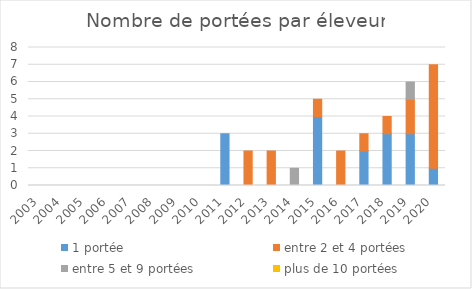
| Category | 1 portée | entre 2 et 4 portées | entre 5 et 9 portées | plus de 10 portées |
|---|---|---|---|---|
| 2003.0 | 0 | 0 | 0 | 0 |
| 2004.0 | 0 | 0 | 0 | 0 |
| 2005.0 | 0 | 0 | 0 | 0 |
| 2006.0 | 0 | 0 | 0 | 0 |
| 2007.0 | 0 | 0 | 0 | 0 |
| 2008.0 | 0 | 0 | 0 | 0 |
| 2009.0 | 0 | 0 | 0 | 0 |
| 2010.0 | 0 | 0 | 0 | 0 |
| 2011.0 | 3 | 0 | 0 | 0 |
| 2012.0 | 0 | 2 | 0 | 0 |
| 2013.0 | 0 | 2 | 0 | 0 |
| 2014.0 | 0 | 0 | 1 | 0 |
| 2015.0 | 4 | 1 | 0 | 0 |
| 2016.0 | 0 | 2 | 0 | 0 |
| 2017.0 | 2 | 1 | 0 | 0 |
| 2018.0 | 3 | 1 | 0 | 0 |
| 2019.0 | 3 | 2 | 1 | 0 |
| 2020.0 | 1 | 6 | 0 | 0 |